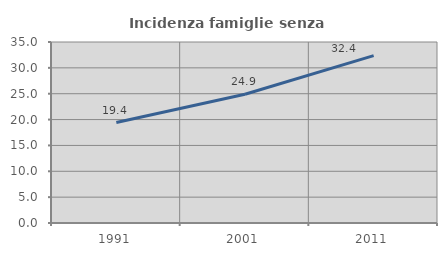
| Category | Incidenza famiglie senza nuclei |
|---|---|
| 1991.0 | 19.427 |
| 2001.0 | 24.906 |
| 2011.0 | 32.364 |